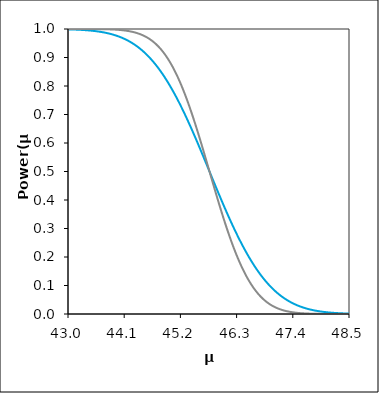
| Category | blue | red |
|---|---|---|
| 43.01138721247417 | 0.999 | 1 |
| 43.02234166362427 | 0.999 | 1 |
| 43.03329611477438 | 0.999 | 1 |
| 43.04425056592449 | 0.998 | 1 |
| 43.0552050170746 | 0.998 | 1 |
| 43.0661594682247 | 0.998 | 1 |
| 43.0771139193748 | 0.998 | 1 |
| 43.0880683705249 | 0.998 | 1 |
| 43.09902282167501 | 0.998 | 1 |
| 43.10997727282512 | 0.998 | 1 |
| 43.12093172397522 | 0.998 | 1 |
| 43.13188617512533 | 0.998 | 1 |
| 43.14284062627544 | 0.998 | 1 |
| 43.15379507742554 | 0.998 | 1 |
| 43.16474952857564 | 0.998 | 1 |
| 43.17570397972575 | 0.998 | 1 |
| 43.18665843087585 | 0.998 | 1 |
| 43.19761288202596 | 0.997 | 1 |
| 43.20856733317607 | 0.997 | 1 |
| 43.21952178432618 | 0.997 | 1 |
| 43.23047623547628 | 0.997 | 1 |
| 43.24143068662639 | 0.997 | 1 |
| 43.2523851377765 | 0.997 | 1 |
| 43.2633395889266 | 0.997 | 1 |
| 43.2742940400767 | 0.997 | 1 |
| 43.28524849122681 | 0.997 | 1 |
| 43.2962029423769 | 0.996 | 1 |
| 43.30715739352702 | 0.996 | 1 |
| 43.31811184467712 | 0.996 | 1 |
| 43.32906629582723 | 0.996 | 1 |
| 43.34002074697734 | 0.996 | 1 |
| 43.35097519812744 | 0.996 | 1 |
| 43.36192964927755 | 0.996 | 1 |
| 43.37288410042765 | 0.995 | 1 |
| 43.38383855157776 | 0.995 | 1 |
| 43.39479300272787 | 0.995 | 1 |
| 43.40574745387797 | 0.995 | 1 |
| 43.41670190502808 | 0.995 | 1 |
| 43.42765635617818 | 0.995 | 1 |
| 43.43861080732829 | 0.994 | 1 |
| 43.4495652584784 | 0.994 | 1 |
| 43.4605197096285 | 0.994 | 1 |
| 43.47147416077861 | 0.994 | 1 |
| 43.48242861192871 | 0.994 | 1 |
| 43.49338306307882 | 0.993 | 1 |
| 43.50433751422892 | 0.993 | 1 |
| 43.51529196537903 | 0.993 | 1 |
| 43.52624641652913 | 0.993 | 1 |
| 43.53720086767924 | 0.992 | 1 |
| 43.54815531882934 | 0.992 | 1 |
| 43.55910976997945 | 0.992 | 1 |
| 43.57006422112956 | 0.992 | 1 |
| 43.58101867227966 | 0.991 | 1 |
| 43.59197312342976 | 0.991 | 1 |
| 43.60292757457987 | 0.991 | 1 |
| 43.61388202572998 | 0.99 | 1 |
| 43.62483647688008 | 0.99 | 1 |
| 43.63579092803018 | 0.99 | 0.999 |
| 43.6467453791803 | 0.989 | 0.999 |
| 43.6576998303304 | 0.989 | 0.999 |
| 43.66865428148051 | 0.989 | 0.999 |
| 43.67960873263061 | 0.988 | 0.999 |
| 43.69056318378072 | 0.988 | 0.999 |
| 43.70151763493082 | 0.988 | 0.999 |
| 43.71247208608092 | 0.987 | 0.999 |
| 43.72342653723103 | 0.987 | 0.999 |
| 43.73438098838114 | 0.986 | 0.999 |
| 43.74533543953124 | 0.986 | 0.999 |
| 43.75628989068135 | 0.986 | 0.999 |
| 43.76724434183146 | 0.985 | 0.999 |
| 43.77819879298156 | 0.985 | 0.999 |
| 43.78915324413166 | 0.984 | 0.999 |
| 43.80010769528177 | 0.984 | 0.999 |
| 43.81106214643188 | 0.983 | 0.999 |
| 43.82201659758198 | 0.983 | 0.999 |
| 43.8329710487321 | 0.982 | 0.999 |
| 43.8439254998822 | 0.982 | 0.998 |
| 43.8548799510323 | 0.981 | 0.998 |
| 43.86583440218241 | 0.98 | 0.998 |
| 43.87678885333251 | 0.98 | 0.998 |
| 43.88774330448262 | 0.979 | 0.998 |
| 43.89869775563272 | 0.979 | 0.998 |
| 43.90965220678283 | 0.978 | 0.998 |
| 43.92060665793294 | 0.977 | 0.998 |
| 43.93156110908304 | 0.977 | 0.998 |
| 43.94251556023315 | 0.976 | 0.997 |
| 43.95347001138325 | 0.975 | 0.997 |
| 43.96442446253336 | 0.975 | 0.997 |
| 43.97537891368346 | 0.974 | 0.997 |
| 43.98633336483357 | 0.973 | 0.997 |
| 43.99728781598368 | 0.973 | 0.997 |
| 44.00824226713378 | 0.972 | 0.997 |
| 44.01919671828389 | 0.971 | 0.996 |
| 44.030151169434 | 0.97 | 0.996 |
| 44.0411056205841 | 0.969 | 0.996 |
| 44.0520600717342 | 0.969 | 0.996 |
| 44.06301452288431 | 0.968 | 0.996 |
| 44.07396897403441 | 0.967 | 0.995 |
| 44.08492342518452 | 0.966 | 0.995 |
| 44.09587787633463 | 0.965 | 0.995 |
| 44.10683232748473 | 0.964 | 0.995 |
| 44.11778677863484 | 0.963 | 0.994 |
| 44.12874122978494 | 0.962 | 0.994 |
| 44.13969568093504 | 0.961 | 0.994 |
| 44.15065013208515 | 0.96 | 0.993 |
| 44.16160458323526 | 0.959 | 0.993 |
| 44.17255903438536 | 0.958 | 0.993 |
| 44.18351348553547 | 0.957 | 0.992 |
| 44.19446793668558 | 0.956 | 0.992 |
| 44.20542238783568 | 0.955 | 0.992 |
| 44.21637683898578 | 0.954 | 0.991 |
| 44.2273312901359 | 0.952 | 0.991 |
| 44.238285741286 | 0.951 | 0.99 |
| 44.2492401924361 | 0.95 | 0.99 |
| 44.26019464358621 | 0.949 | 0.99 |
| 44.27114909473632 | 0.947 | 0.989 |
| 44.28210354588642 | 0.946 | 0.989 |
| 44.29305799703653 | 0.945 | 0.988 |
| 44.30401244818663 | 0.943 | 0.987 |
| 44.31496689933674 | 0.942 | 0.987 |
| 44.32592135048684 | 0.941 | 0.986 |
| 44.33687580163695 | 0.939 | 0.986 |
| 44.34783025278706 | 0.938 | 0.985 |
| 44.35878470393716 | 0.936 | 0.984 |
| 44.36973915508727 | 0.935 | 0.984 |
| 44.38069360623737 | 0.933 | 0.983 |
| 44.39164805738748 | 0.932 | 0.982 |
| 44.40260250853758 | 0.93 | 0.982 |
| 44.41355695968769 | 0.928 | 0.981 |
| 44.4245114108378 | 0.927 | 0.98 |
| 44.4354658619879 | 0.925 | 0.979 |
| 44.44642031313801 | 0.923 | 0.978 |
| 44.45737476428811 | 0.922 | 0.977 |
| 44.46832921543822 | 0.92 | 0.976 |
| 44.47928366658832 | 0.918 | 0.975 |
| 44.49023811773843 | 0.916 | 0.975 |
| 44.50119256888853 | 0.914 | 0.973 |
| 44.51214702003864 | 0.912 | 0.972 |
| 44.52310147118874 | 0.911 | 0.971 |
| 44.53405592233885 | 0.909 | 0.97 |
| 44.54501037348895 | 0.907 | 0.969 |
| 44.55596482463906 | 0.905 | 0.968 |
| 44.56691927578917 | 0.903 | 0.967 |
| 44.57787372693927 | 0.9 | 0.965 |
| 44.58882817808938 | 0.898 | 0.964 |
| 44.59978262923948 | 0.896 | 0.963 |
| 44.6107370803896 | 0.894 | 0.961 |
| 44.6216915315397 | 0.892 | 0.96 |
| 44.6326459826898 | 0.89 | 0.958 |
| 44.64360043383991 | 0.887 | 0.957 |
| 44.65455488499001 | 0.885 | 0.955 |
| 44.66550933614011 | 0.883 | 0.954 |
| 44.67646378729022 | 0.88 | 0.952 |
| 44.68741823844033 | 0.878 | 0.95 |
| 44.69837268959043 | 0.875 | 0.948 |
| 44.70932714074054 | 0.873 | 0.947 |
| 44.72028159189065 | 0.87 | 0.945 |
| 44.73123604304075 | 0.868 | 0.943 |
| 44.74219049419085 | 0.865 | 0.941 |
| 44.75314494534096 | 0.863 | 0.939 |
| 44.76409939649107 | 0.86 | 0.937 |
| 44.77505384764117 | 0.857 | 0.935 |
| 44.78600829879128 | 0.855 | 0.932 |
| 44.79696274994138 | 0.852 | 0.93 |
| 44.80791720109149 | 0.849 | 0.928 |
| 44.8188716522416 | 0.846 | 0.925 |
| 44.8298261033917 | 0.843 | 0.923 |
| 44.84078055454181 | 0.84 | 0.921 |
| 44.85173500569191 | 0.837 | 0.918 |
| 44.86268945684202 | 0.834 | 0.915 |
| 44.87364390799213 | 0.831 | 0.913 |
| 44.88459835914223 | 0.828 | 0.91 |
| 44.89555281029234 | 0.825 | 0.907 |
| 44.90650726144244 | 0.822 | 0.904 |
| 44.91746171259255 | 0.819 | 0.901 |
| 44.92841616374265 | 0.816 | 0.898 |
| 44.93937061489276 | 0.813 | 0.895 |
| 44.95032506604286 | 0.809 | 0.892 |
| 44.96127951719297 | 0.806 | 0.889 |
| 44.97223396834308 | 0.803 | 0.886 |
| 44.98318841949318 | 0.8 | 0.883 |
| 44.99414287064329 | 0.796 | 0.879 |
| 45.00509732179339 | 0.793 | 0.876 |
| 45.0160517729435 | 0.789 | 0.872 |
| 45.0270062240936 | 0.786 | 0.869 |
| 45.03796067524371 | 0.782 | 0.865 |
| 45.04891512639381 | 0.779 | 0.861 |
| 45.05986957754392 | 0.775 | 0.857 |
| 45.07082402869403 | 0.772 | 0.854 |
| 45.08177847984413 | 0.768 | 0.85 |
| 45.09273293099423 | 0.764 | 0.846 |
| 45.10368738214434 | 0.761 | 0.842 |
| 45.11464183329445 | 0.757 | 0.838 |
| 45.12559628444455 | 0.753 | 0.833 |
| 45.13655073559466 | 0.749 | 0.829 |
| 45.14750518674477 | 0.745 | 0.825 |
| 45.15845963789487 | 0.742 | 0.82 |
| 45.16941408904498 | 0.738 | 0.816 |
| 45.18036854019508 | 0.734 | 0.811 |
| 45.19132299134519 | 0.73 | 0.807 |
| 45.2022774424953 | 0.726 | 0.802 |
| 45.2132318936454 | 0.722 | 0.797 |
| 45.2241863447955 | 0.718 | 0.792 |
| 45.23514079594561 | 0.714 | 0.787 |
| 45.24609524709571 | 0.71 | 0.782 |
| 45.25704969824582 | 0.705 | 0.777 |
| 45.26800414939592 | 0.701 | 0.772 |
| 45.27895860054603 | 0.697 | 0.767 |
| 45.28991305169614 | 0.693 | 0.762 |
| 45.30086750284624 | 0.689 | 0.757 |
| 45.31182195399635 | 0.684 | 0.751 |
| 45.32277640514646 | 0.68 | 0.746 |
| 45.33373085629656 | 0.676 | 0.74 |
| 45.34468530744667 | 0.671 | 0.735 |
| 45.35563975859677 | 0.667 | 0.729 |
| 45.36659420974688 | 0.663 | 0.724 |
| 45.37754866089698 | 0.658 | 0.718 |
| 45.38850311204709 | 0.654 | 0.712 |
| 45.3994575631972 | 0.65 | 0.706 |
| 45.4104120143473 | 0.645 | 0.701 |
| 45.42136646549741 | 0.641 | 0.695 |
| 45.43232091664751 | 0.636 | 0.689 |
| 45.44327536779762 | 0.632 | 0.683 |
| 45.45422981894772 | 0.627 | 0.677 |
| 45.46518427009783 | 0.622 | 0.67 |
| 45.47613872124793 | 0.618 | 0.664 |
| 45.48709317239804 | 0.613 | 0.658 |
| 45.49804762354815 | 0.609 | 0.652 |
| 45.50900207469825 | 0.604 | 0.646 |
| 45.51995652584836 | 0.599 | 0.639 |
| 45.53091097699846 | 0.595 | 0.633 |
| 45.54186542814857 | 0.59 | 0.626 |
| 45.55281987929867 | 0.586 | 0.62 |
| 45.56377433044877 | 0.581 | 0.614 |
| 45.57472878159889 | 0.576 | 0.607 |
| 45.585683232749 | 0.571 | 0.6 |
| 45.5966376838991 | 0.567 | 0.594 |
| 45.6075921350492 | 0.562 | 0.587 |
| 45.61854658619931 | 0.557 | 0.581 |
| 45.62950103734941 | 0.553 | 0.574 |
| 45.64045548849952 | 0.548 | 0.567 |
| 45.65140993964962 | 0.543 | 0.561 |
| 45.66236439079973 | 0.538 | 0.554 |
| 45.67331884194983 | 0.533 | 0.547 |
| 45.68427329309994 | 0.529 | 0.541 |
| 45.69522774425004 | 0.524 | 0.534 |
| 45.70618219540015 | 0.519 | 0.527 |
| 45.71713664655025 | 0.514 | 0.52 |
| 45.72809109770036 | 0.51 | 0.514 |
| 45.73904554885047 | 0.505 | 0.507 |
| 45.75000000000058 | 0.5 | 0.5 |
| 45.76095445115068 | 0.495 | 0.493 |
| 45.77190890230078 | 0.49 | 0.486 |
| 45.7828633534509 | 0.486 | 0.48 |
| 45.793817804601 | 0.481 | 0.473 |
| 45.8047722557511 | 0.476 | 0.466 |
| 45.81572670690121 | 0.471 | 0.459 |
| 45.82668115805131 | 0.467 | 0.453 |
| 45.83763560920142 | 0.462 | 0.446 |
| 45.84859006035153 | 0.457 | 0.439 |
| 45.85954451150163 | 0.452 | 0.433 |
| 45.87049896265174 | 0.447 | 0.426 |
| 45.88145341380184 | 0.443 | 0.419 |
| 45.89240786495194 | 0.438 | 0.413 |
| 45.90336231610205 | 0.433 | 0.406 |
| 45.91431676725216 | 0.429 | 0.4 |
| 45.92527121840227 | 0.424 | 0.393 |
| 45.93622566955237 | 0.419 | 0.386 |
| 45.94718012070248 | 0.414 | 0.38 |
| 45.95813457185258 | 0.41 | 0.374 |
| 45.96908902300269 | 0.405 | 0.367 |
| 45.98004347415279 | 0.401 | 0.361 |
| 45.9909979253029 | 0.396 | 0.354 |
| 46.001952376453 | 0.391 | 0.348 |
| 46.01290682760311 | 0.387 | 0.342 |
| 46.02386127875322 | 0.382 | 0.336 |
| 46.03481572990332 | 0.378 | 0.33 |
| 46.04577018105343 | 0.373 | 0.323 |
| 46.05672463220353 | 0.368 | 0.317 |
| 46.06767908335364 | 0.364 | 0.311 |
| 46.07863353450374 | 0.359 | 0.305 |
| 46.08958798565385 | 0.355 | 0.299 |
| 46.10054243680395 | 0.35 | 0.294 |
| 46.11149688795406 | 0.346 | 0.288 |
| 46.12245133910416 | 0.342 | 0.282 |
| 46.13340579025427 | 0.337 | 0.276 |
| 46.14436024140438 | 0.333 | 0.271 |
| 46.15531469255448 | 0.329 | 0.265 |
| 46.16626914370459 | 0.324 | 0.26 |
| 46.17722359485469 | 0.32 | 0.254 |
| 46.1881780460048 | 0.316 | 0.249 |
| 46.1991324971549 | 0.311 | 0.243 |
| 46.21008694830501 | 0.307 | 0.238 |
| 46.22104139945512 | 0.303 | 0.233 |
| 46.23199585060522 | 0.299 | 0.228 |
| 46.24295030175532 | 0.295 | 0.223 |
| 46.25390475290543 | 0.29 | 0.218 |
| 46.26485920405554 | 0.286 | 0.213 |
| 46.27581365520565 | 0.282 | 0.208 |
| 46.28676810635575 | 0.278 | 0.203 |
| 46.29772255750585 | 0.274 | 0.198 |
| 46.30867700865596 | 0.27 | 0.193 |
| 46.31963145980607 | 0.266 | 0.189 |
| 46.33058591095617 | 0.262 | 0.184 |
| 46.34154036210628 | 0.258 | 0.18 |
| 46.35249481325638 | 0.255 | 0.175 |
| 46.36344926440649 | 0.251 | 0.171 |
| 46.3744037155566 | 0.247 | 0.167 |
| 46.3853581667067 | 0.243 | 0.162 |
| 46.3963126178568 | 0.239 | 0.158 |
| 46.40726706900691 | 0.236 | 0.154 |
| 46.41822152015702 | 0.232 | 0.15 |
| 46.42917597130712 | 0.228 | 0.146 |
| 46.44013042245723 | 0.225 | 0.143 |
| 46.45108487360734 | 0.221 | 0.139 |
| 46.46203932475744 | 0.218 | 0.135 |
| 46.47299377590755 | 0.214 | 0.131 |
| 46.48394822705765 | 0.211 | 0.128 |
| 46.49490267820776 | 0.207 | 0.124 |
| 46.50585712935786 | 0.204 | 0.121 |
| 46.51681158050797 | 0.2 | 0.117 |
| 46.52776603165808 | 0.197 | 0.114 |
| 46.53872048280818 | 0.194 | 0.111 |
| 46.54967493395829 | 0.191 | 0.108 |
| 46.5606293851084 | 0.187 | 0.105 |
| 46.5715838362585 | 0.184 | 0.102 |
| 46.5825382874086 | 0.181 | 0.099 |
| 46.5934927385587 | 0.178 | 0.096 |
| 46.60444718970881 | 0.175 | 0.093 |
| 46.61540164085892 | 0.172 | 0.09 |
| 46.62635609200902 | 0.169 | 0.087 |
| 46.63731054315913 | 0.166 | 0.085 |
| 46.64826499430924 | 0.163 | 0.082 |
| 46.65921944545934 | 0.16 | 0.079 |
| 46.67017389660944 | 0.157 | 0.077 |
| 46.68112834775955 | 0.154 | 0.075 |
| 46.69208279890965 | 0.151 | 0.072 |
| 46.70303725005976 | 0.148 | 0.07 |
| 46.71399170120987 | 0.145 | 0.068 |
| 46.72494615235997 | 0.143 | 0.065 |
| 46.73590060351008 | 0.14 | 0.063 |
| 46.74685505466019 | 0.137 | 0.061 |
| 46.75780950581029 | 0.135 | 0.059 |
| 46.7687639569604 | 0.132 | 0.057 |
| 46.7797184081105 | 0.13 | 0.055 |
| 46.79067285926061 | 0.127 | 0.053 |
| 46.80162731041072 | 0.125 | 0.052 |
| 46.81258176156082 | 0.122 | 0.05 |
| 46.82353621271092 | 0.12 | 0.048 |
| 46.83449066386103 | 0.117 | 0.046 |
| 46.84544511501114 | 0.115 | 0.045 |
| 46.85639956616124 | 0.113 | 0.043 |
| 46.86735401731135 | 0.11 | 0.042 |
| 46.87830846846145 | 0.108 | 0.04 |
| 46.88926291961156 | 0.106 | 0.039 |
| 46.90021737076167 | 0.104 | 0.037 |
| 46.91117182191177 | 0.102 | 0.036 |
| 46.92212627306187 | 0.1 | 0.035 |
| 46.93308072421198 | 0.097 | 0.033 |
| 46.94403517536209 | 0.095 | 0.032 |
| 46.95498962651219 | 0.093 | 0.031 |
| 46.9659440776623 | 0.091 | 0.03 |
| 46.97689852881241 | 0.089 | 0.029 |
| 46.98785297996251 | 0.088 | 0.028 |
| 46.99880743111262 | 0.086 | 0.027 |
| 47.00976188226272 | 0.084 | 0.025 |
| 47.02071633341282 | 0.082 | 0.025 |
| 47.03167078456293 | 0.08 | 0.024 |
| 47.04262523571304 | 0.078 | 0.023 |
| 47.05357968686315 | 0.077 | 0.022 |
| 47.06453413801325 | 0.075 | 0.021 |
| 47.07548858916336 | 0.073 | 0.02 |
| 47.08644304031346 | 0.072 | 0.019 |
| 47.09739749146357 | 0.07 | 0.018 |
| 47.10835194261367 | 0.068 | 0.018 |
| 47.11930639376378 | 0.067 | 0.017 |
| 47.13026084491388 | 0.065 | 0.016 |
| 47.141215296064 | 0.064 | 0.016 |
| 47.1521697472141 | 0.062 | 0.015 |
| 47.1631241983642 | 0.061 | 0.014 |
| 47.17407864951431 | 0.059 | 0.014 |
| 47.18503310066441 | 0.058 | 0.013 |
| 47.19598755181452 | 0.057 | 0.013 |
| 47.20694200296462 | 0.055 | 0.012 |
| 47.21789645411473 | 0.054 | 0.011 |
| 47.22885090526483 | 0.053 | 0.011 |
| 47.23980535641494 | 0.051 | 0.01 |
| 47.25075980756504 | 0.05 | 0.01 |
| 47.26171425871515 | 0.049 | 0.01 |
| 47.27266870986526 | 0.048 | 0.009 |
| 47.28362316101536 | 0.046 | 0.009 |
| 47.29457761216547 | 0.045 | 0.008 |
| 47.30553206331557 | 0.044 | 0.008 |
| 47.31648651446568 | 0.043 | 0.008 |
| 47.32744096561579 | 0.042 | 0.007 |
| 47.3383954167659 | 0.041 | 0.007 |
| 47.349349867916 | 0.04 | 0.007 |
| 47.3603043190661 | 0.039 | 0.006 |
| 47.37125877021621 | 0.038 | 0.006 |
| 47.38221322136631 | 0.037 | 0.006 |
| 47.39316767251642 | 0.036 | 0.005 |
| 47.40412212366653 | 0.035 | 0.005 |
| 47.41507657481663 | 0.034 | 0.005 |
| 47.42603102596674 | 0.033 | 0.005 |
| 47.43698547711684 | 0.032 | 0.004 |
| 47.44793992826695 | 0.031 | 0.004 |
| 47.45889437941705 | 0.031 | 0.004 |
| 47.46984883056716 | 0.03 | 0.004 |
| 47.48080328171726 | 0.029 | 0.004 |
| 47.49175773286737 | 0.028 | 0.003 |
| 47.50271218401747 | 0.027 | 0.003 |
| 47.51366663516758 | 0.027 | 0.003 |
| 47.52462108631769 | 0.026 | 0.003 |
| 47.5355755374678 | 0.025 | 0.003 |
| 47.5465299886179 | 0.025 | 0.003 |
| 47.557484439768 | 0.024 | 0.003 |
| 47.5684388909181 | 0.023 | 0.002 |
| 47.57939334206821 | 0.023 | 0.002 |
| 47.59034779321832 | 0.022 | 0.002 |
| 47.60130224436842 | 0.021 | 0.002 |
| 47.61225669551853 | 0.021 | 0.002 |
| 47.62321114666864 | 0.02 | 0.002 |
| 47.63416559781874 | 0.02 | 0.002 |
| 47.64512004896884 | 0.019 | 0.002 |
| 47.65607450011895 | 0.018 | 0.002 |
| 47.66702895126906 | 0.018 | 0.001 |
| 47.67798340241917 | 0.017 | 0.001 |
| 47.68893785356927 | 0.017 | 0.001 |
| 47.69989230471937 | 0.016 | 0.001 |
| 47.71084675586948 | 0.016 | 0.001 |
| 47.72180120701959 | 0.015 | 0.001 |
| 47.7327556581697 | 0.015 | 0.001 |
| 47.7437101093198 | 0.014 | 0.001 |
| 47.75466456046991 | 0.014 | 0.001 |
| 47.76561901162001 | 0.014 | 0.001 |
| 47.77657346277012 | 0.013 | 0.001 |
| 47.78752791392022 | 0.013 | 0.001 |
| 47.79848236507032 | 0.012 | 0.001 |
| 47.80943681622043 | 0.012 | 0.001 |
| 47.82039126737054 | 0.012 | 0.001 |
| 47.83134571852064 | 0.011 | 0.001 |
| 47.84230016967075 | 0.011 | 0.001 |
| 47.85325462082086 | 0.011 | 0.001 |
| 47.86420907197096 | 0.01 | 0.001 |
| 47.87516352312107 | 0.01 | 0 |
| 47.88611797427117 | 0.01 | 0 |
| 47.89707242542128 | 0.009 | 0 |
| 47.90802687657138 | 0.009 | 0 |
| 47.91898132772149 | 0.009 | 0 |
| 47.9299357788716 | 0.008 | 0 |
| 47.9408902300217 | 0.008 | 0 |
| 47.95184468117181 | 0.008 | 0 |
| 47.9627991323219 | 0.008 | 0 |
| 47.97375358347202 | 0.007 | 0 |
| 47.98470803462212 | 0.007 | 0 |
| 47.99566248577223 | 0.007 | 0 |
| 48.00661693692233 | 0.007 | 0 |
| 48.01757138807244 | 0.006 | 0 |
| 48.02852583922254 | 0.006 | 0 |
| 48.03948029037265 | 0.006 | 0 |
| 48.05043474152276 | 0.006 | 0 |
| 48.06138919267286 | 0.006 | 0 |
| 48.07234364382297 | 0.005 | 0 |
| 48.08329809497307 | 0.005 | 0 |
| 48.09425254612317 | 0.005 | 0 |
| 48.10520699727329 | 0.005 | 0 |
| 48.1161614484234 | 0.005 | 0 |
| 48.1271158995735 | 0.005 | 0 |
| 48.1380703507236 | 0.004 | 0 |
| 48.14902480187371 | 0.004 | 0 |
| 48.15997925302381 | 0.004 | 0 |
| 48.17093370417391 | 0.004 | 0 |
| 48.18188815532402 | 0.004 | 0 |
| 48.19284260647413 | 0.004 | 0 |
| 48.20379705762424 | 0.004 | 0 |
| 48.21475150877434 | 0.003 | 0 |
| 48.22570595992444 | 0.003 | 0 |
| 48.23666041107455 | 0.003 | 0 |
| 48.24761486222466 | 0.003 | 0 |
| 48.25856931337476 | 0.003 | 0 |
| 48.26952376452486 | 0.003 | 0 |
| 48.28047821567497 | 0.003 | 0 |
| 48.29143266682508 | 0.003 | 0 |
| 48.30238711797519 | 0.003 | 0 |
| 48.31334156912529 | 0.002 | 0 |
| 48.3242960202754 | 0.002 | 0 |
| 48.3352504714255 | 0.002 | 0 |
| 48.34620492257561 | 0.002 | 0 |
| 48.35715937372571 | 0.002 | 0 |
| 48.3681138248758 | 0.002 | 0 |
| 48.37906827602592 | 0.002 | 0 |
| 48.39002272717603 | 0.002 | 0 |
| 48.40097717832614 | 0.002 | 0 |
| 48.41193162947624 | 0.002 | 0 |
| 48.42288608062635 | 0.002 | 0 |
| 48.43384053177645 | 0.002 | 0 |
| 48.44479498292656 | 0.002 | 0 |
| 48.45574943407667 | 0.002 | 0 |
| 48.46670388522677 | 0.001 | 0 |
| 48.47765833637687 | 0.001 | 0 |
| 48.48861278752698 | 0.001 | 0 |